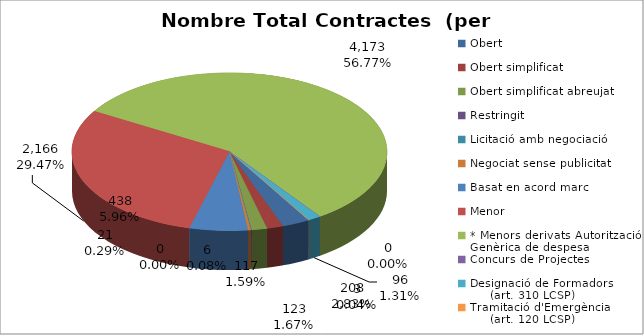
| Category | Nombre Total Contractes |
|---|---|
| Obert | 208 |
| Obert simplificat | 123 |
| Obert simplificat abreujat | 117 |
| Restringit | 6 |
| Licitació amb negociació | 0 |
| Negociat sense publicitat | 21 |
| Basat en acord marc | 438 |
| Menor | 2166 |
| * Menors derivats Autorització Genèrica de despesa | 4173 |
| Concurs de Projectes | 0 |
| Designació de Formadors
     (art. 310 LCSP) | 96 |
| Tramitació d'Emergència
     (art. 120 LCSP) | 3 |